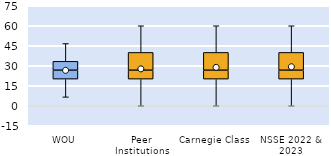
| Category | 25th | 50th | 75th |
|---|---|---|---|
| WOU | 20 | 6.667 | 6.667 |
| Peer Institutions | 20 | 6.667 | 13.333 |
| Carnegie Class | 20 | 6.667 | 13.333 |
| NSSE 2022 & 2023 | 20 | 6.667 | 13.333 |